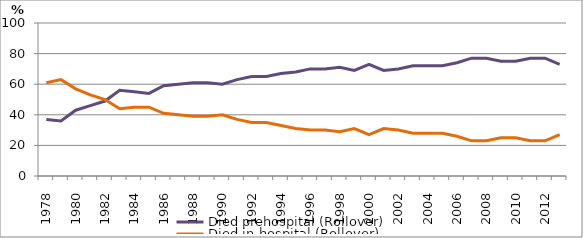
| Category | Died prehospital (Rollover) | Died in-hospital (Rollover) |
|---|---|---|
| 1978.0 | 37 | 61 |
| 1979.0 | 36 | 63 |
| 1980.0 | 43 | 57 |
| 1981.0 | 46 | 53 |
| 1982.0 | 49 | 50 |
| 1983.0 | 56 | 44 |
| 1984.0 | 55 | 45 |
| 1985.0 | 54 | 45 |
| 1986.0 | 59 | 41 |
| 1987.0 | 60 | 40 |
| 1988.0 | 61 | 39 |
| 1989.0 | 61 | 39 |
| 1990.0 | 60 | 40 |
| 1991.0 | 63 | 37 |
| 1992.0 | 65 | 35 |
| 1993.0 | 65 | 35 |
| 1994.0 | 67 | 33 |
| 1995.0 | 68 | 31 |
| 1996.0 | 70 | 30 |
| 1997.0 | 70 | 30 |
| 1998.0 | 71 | 29 |
| 1999.0 | 69 | 31 |
| 2000.0 | 73 | 27 |
| 2001.0 | 69 | 31 |
| 2002.0 | 70 | 30 |
| 2003.0 | 72 | 28 |
| 2004.0 | 72 | 28 |
| 2005.0 | 72 | 28 |
| 2006.0 | 74 | 26 |
| 2007.0 | 77 | 23 |
| 2008.0 | 77 | 23 |
| 2009.0 | 75 | 25 |
| 2010.0 | 75 | 25 |
| 2011.0 | 77 | 23 |
| 2012.0 | 77 | 23 |
| 2013.0 | 73 | 27 |